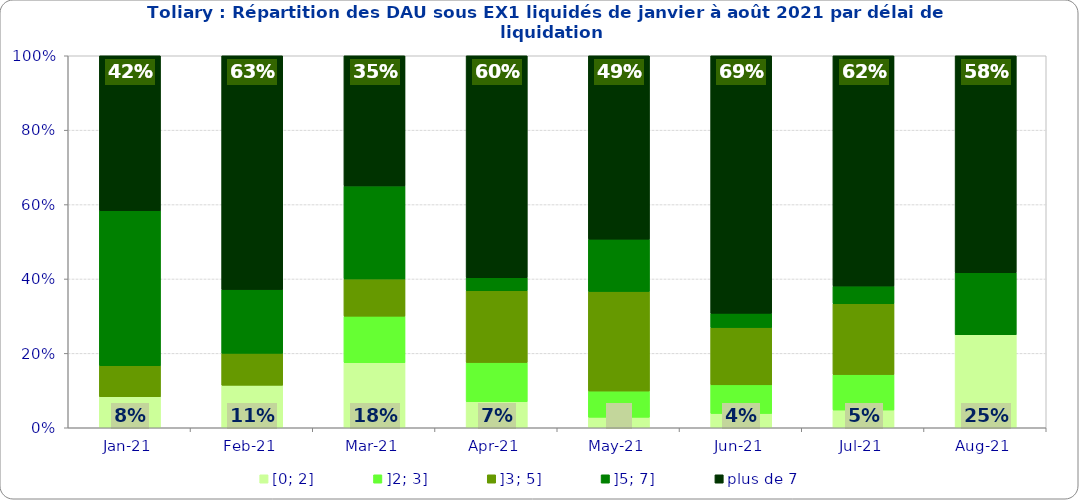
| Category | [0; 2] | ]2; 3] | ]3; 5] | ]5; 7] | plus de 7 |
|---|---|---|---|---|---|
| 2021-01-01 | 0.083 | 0 | 0.083 | 0.417 | 0.417 |
| 2021-02-01 | 0.114 | 0 | 0.086 | 0.171 | 0.629 |
| 2021-03-01 | 0.175 | 0.125 | 0.1 | 0.25 | 0.35 |
| 2021-04-01 | 0.07 | 0.105 | 0.193 | 0.035 | 0.596 |
| 2021-05-01 | 0.028 | 0.07 | 0.268 | 0.141 | 0.493 |
| 2021-06-01 | 0.038 | 0.077 | 0.154 | 0.038 | 0.692 |
| 2021-07-01 | 0.048 | 0.095 | 0.19 | 0.048 | 0.619 |
| 2021-08-01 | 0.25 | 0 | 0 | 0.167 | 0.583 |